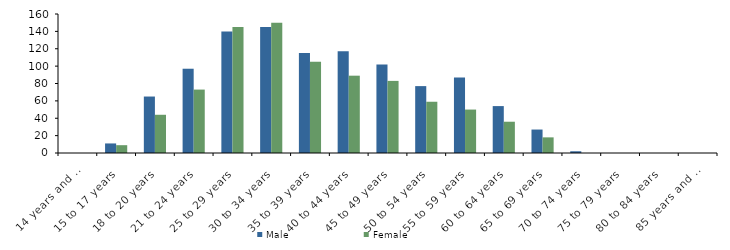
| Category | Male | Female |
|---|---|---|
| 14 years and under | 0 | 0 |
| 15 to 17 years | 11 | 9 |
| 18 to 20 years | 65 | 44 |
| 21 to 24 years | 97 | 73 |
| 25 to 29 years | 140 | 145 |
| 30 to 34 years | 145 | 150 |
| 35 to 39 years | 115 | 105 |
| 40 to 44 years | 117 | 89 |
| 45 to 49 years | 102 | 83 |
| 50 to 54 years | 77 | 59 |
| 55 to 59 years | 87 | 50 |
| 60 to 64 years | 54 | 36 |
| 65 to 69 years | 27 | 18 |
| 70 to 74 years | 2 | 0 |
| 75 to 79 years | 0 | 0 |
| 80 to 84 years | 0 | 0 |
| 85 years and over | 0 | 0 |